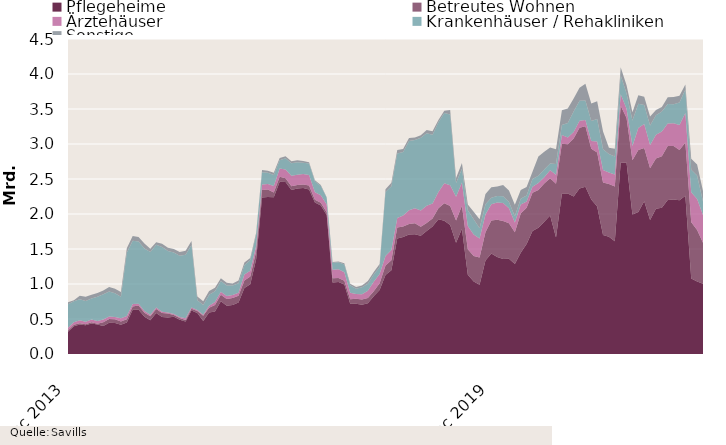
| Category | Pflegeheime | Betreutes Wohnen | Ärztehäuser | Krankenhäuser / Rehakliniken | Sonstige |
|---|---|---|---|---|---|
| 2013-12-01 | 316072110 | 21150000 | 36229348 | 338787993 | 26674299 |
| 2014-01-01 | 396122000 | 21150000 | 36229348 | 301467992 | 14024299 |
| 2014-02-01 | 423017999 | 16996000 | 41229348 | 301467992 | 49024299 |
| 2014-03-01 | 409587999 | 16996000 | 33896100 | 297467994 | 60915344 |
| 2014-04-01 | 436479999 | 16996000 | 38896100 | 299927994 | 54915344 |
| 2014-05-01 | 420451999 | 12372000 | 38896100 | 345627991 | 54915344 |
| 2014-06-01 | 400251999 | 53047000 | 38896100 | 360127987 | 54915344 |
| 2014-07-01 | 447606996 | 53047000 | 35000000 | 357127989 | 63009744 |
| 2014-08-01 | 442116996 | 53047000 | 35000000 | 337739742 | 63009744 |
| 2014-09-01 | 416316995 | 46247000 | 47499999 | 307299740 | 67509743 |
| 2014-10-01 | 450246995 | 46247000 | 47499999 | 901299740 | 65760544 |
| 2014-11-01 | 633736081 | 43759854 | 35999999 | 904699738 | 65760544 |
| 2014-12-01 | 633736081 | 57759854 | 25749999 | 891599738 | 64340644 |
| 2015-01-01 | 530736081 | 57759854 | 25749999 | 891599738 | 71465644 |
| 2015-02-01 | 483168082 | 57759854 | 20749999 | 896099737 | 47465644 |
| 2015-03-01 | 584248082 | 57759854 | 20749999 | 897080987 | 35574599 |
| 2015-04-01 | 529356082 | 57759854 | 15749999 | 924420986 | 46426599 |
| 2015-05-01 | 520608080 | 57759854 | 15749999 | 878720989 | 46426599 |
| 2015-06-01 | 533256112 | 23084854 | 15749999 | 876900990 | 49446599 |
| 2015-07-01 | 490421115 | 23084854 | 15749999 | 875398489 | 52902199 |
| 2015-08-01 | 463331115 | 23084854 | 22535999 | 907658735 | 59202199 |
| 2015-09-01 | 621256115 | 25684854 | 16839999 | 894158738 | 54702200 |
| 2015-10-01 | 587326115 | 25684854 | 16839999 | 139658736 | 52047000 |
| 2015-11-01 | 471877887 | 72825922 | 16839999 | 139508737 | 52047000 |
| 2015-12-01 | 593556246 | 68890922 | 27614999 | 157908739 | 52496999 |
| 2016-01-01 | 606656246 | 93190922 | 41614999 | 153408740 | 50721998 |
| 2016-02-01 | 754539246 | 93190922 | 41614999 | 153858740 | 39721998 |
| 2016-03-01 | 687824246 | 98850422 | 41614999 | 149377489 | 39721998 |
| 2016-04-01 | 701548246 | 98850422 | 41614999 | 136827489 | 28869998 |
| 2016-05-01 | 734016248 | 98850422 | 41614999 | 136827489 | 37869998 |
| 2016-06-01 | 941523216 | 109570422 | 83842999 | 134147490 | 39449998 |
| 2016-07-01 | 997563216 | 109570422 | 83842999 | 153319989 | 28209997 |
| 2016-08-01 | 1353063216 | 109570422 | 80368999 | 163139991 | 26909995 |
| 2016-09-01 | 2236038217 | 106970422 | 78890000 | 174533091 | 31909995 |
| 2016-10-01 | 2242038217 | 106970422 | 78890000 | 160033093 | 30909995 |
| 2016-11-01 | 2237654905 | 70446953 | 92390000 | 156208094 | 32409994 |
| 2016-12-01 | 2458976545 | 74801952 | 115752000 | 118658093 | 33459994 |
| 2017-01-01 | 2457326544 | 55001951 | 125059800 | 158158090 | 28109995 |
| 2017-02-01 | 2342511544 | 55001951 | 149359800 | 178733089 | 28109995 |
| 2017-03-01 | 2363283207 | 49342451 | 149359800 | 177233090 | 28109995 |
| 2017-04-01 | 2371659207 | 49792450 | 149359800 | 159983091 | 28109995 |
| 2017-05-01 | 2351709207 | 54792450 | 149359800 | 164483090 | 19109995 |
| 2017-06-01 | 2165904207 | 38072450 | 107131800 | 154483091 | 16259995 |
| 2017-07-01 | 2122064206 | 38072450 | 107131800 | 133313092 | 14749996 |
| 2017-08-01 | 1987264211 | 38072450 | 111838800 | 93893091 | 9749998 |
| 2017-09-01 | 1022249210 | 59156450 | 121613798 | 101239339 | 11749996 |
| 2017-10-01 | 1028249210 | 59156450 | 122794094 | 101239339 | 11749996 |
| 2017-11-01 | 993351664 | 51823997 | 121994094 | 110189339 | 19607117 |
| 2017-12-01 | 717528269.65 | 64485392.34 | 91375634 | 109439340 | 20394618 |
| 2018-01-01 | 716093269.65 | 73735393.34 | 68067834 | 74639342 | 22894617 |
| 2018-02-01 | 702731268.65 | 75083233.34 | 76967834 | 100209344 | 22894617 |
| 2018-03-01 | 726239605.65 | 75083233.34 | 101967834 | 100209344 | 37894617 |
| 2018-04-01 | 823219606.65 | 74633234.34 | 134166234 | 102309343 | 37894617 |
| 2018-05-01 | 915642106.65 | 94273234.34 | 134166234 | 97809344 | 43894617 |
| 2018-06-01 | 1127762106.65 | 138273234.34 | 134166234 | 912809344 | 42144617 |
| 2018-07-01 | 1195392105.65 | 143673234.34 | 145666234 | 910309345 | 51944617 |
| 2018-08-01 | 1648382098.65 | 157723234.34 | 137647234 | 919564346 | 51944617 |
| 2018-09-01 | 1672277099.66 | 147639234.34 | 158043236 | 907324998 | 44944619 |
| 2018-10-01 | 1707357099.66 | 151089234.34 | 195391740 | 988324994 | 44944619 |
| 2018-11-01 | 1711797099.66 | 155979234.34 | 214712300 | 974149994 | 37837498 |
| 2018-12-01 | 1689070494.01 | 128897840 | 232943760 | 1040049993 | 35549998 |
| 2019-01-01 | 1756635495.01 | 115597839 | 246203760 | 1035349994 | 46839999 |
| 2019-02-01 | 1821157496.01 | 114249999 | 213003760 | 985490494 | 46839999 |
| 2019-03-01 | 1925204184.01 | 156848310 | 233003760 | 994090494 | 33089999 |
| 2019-04-01 | 1902076683.01 | 251948310 | 285155359 | 1002880494 | 33089999 |
| 2019-05-01 | 1844150183.01 | 271883310 | 295091359 | 1009130493 | 65889999 |
| 2019-06-01 | 1589330183.01 | 317883310 | 338910558 | 195630492 | 71139999 |
| 2019-07-01 | 1791050185.01 | 326550262 | 332410558 | 195630492 | 83739997 |
| 2019-08-01 | 1133390186.01 | 363547512 | 332410558 | 222875492 | 83739997 |
| 2019-09-01 | 1035775186 | 363547512 | 308580808 | 217521492 | 105439996 |
| 2019-10-01 | 988695186 | 389797512 | 270052008 | 148221496 | 128973996 |
| 2019-11-01 | 1337476185 | 403512512 | 250531448 | 148518696 | 147173996 |
| 2019-12-01 | 1436021186 | 471912512 | 231531448 | 92118696 | 150234746 |
| 2020-01-01 | 1386087141 | 533140013 | 245211448 | 92118696 | 137444745 |
| 2020-02-01 | 1358892933.36 | 541184833 | 256248136 | 96033196 | 162444745 |
| 2020-03-01 | 1359571245.36 | 509586522 | 211248136 | 91933195 | 164594745 |
| 2020-04-01 | 1285138745.36 | 455118522 | 136898136 | 90543196 | 164594745 |
| 2020-05-01 | 1447483164.36 | 559543521.96 | 126962136 | 84293197 | 125794745 |
| 2020-06-01 | 1572243164.36 | 518143521.96 | 89556937 | 82793198 | 124044744 |
| 2020-07-01 | 1757903270.73 | 545381569.96 | 84556937 | 113523198 | 101644746 |
| 2020-08-01 | 1803513271.73 | 538816589.45 | 102061337 | 103523197 | 274144745 |
| 2020-09-01 | 1888440256.54 | 547632192.28 | 90395087 | 109677196 | 252444746 |
| 2020-10-01 | 1978180292 | 533682192.28 | 111995087 | 97977196 | 228910746 |
| 2020-11-01 | 1665039293 | 767307192.28 | 130112487 | 152879995 | 208460747 |
| 2020-12-01 | 2294464292.86 | 710807192.28 | 124112487 | 143379996 | 207709997 |
| 2021-01-01 | 2291797829.77 | 704629692.28 | 97172487 | 205879995 | 206709998 |
| 2021-02-01 | 2251486125.17 | 827692871.28 | 93575799 | 290996995 | 185699998 |
| 2021-03-01 | 2364136125.17 | 868373933.64 | 100275799 | 286496996 | 184924998 |
| 2021-04-01 | 2389616124.17 | 864137936.64 | 90275800 | 276996996 | 240479998 |
| 2021-05-01 | 2208345705.17 | 724537936.68 | 108436800 | 287996996 | 249129998 |
| 2021-06-01 | 2107366705.17 | 772837936.68 | 155468800 | 321096995 | 253629997 |
| 2021-07-01 | 1698576598.8 | 753200536.68 | 178048800 | 296675495 | 253629997 |
| 2021-08-01 | 1673497598.8 | 755702523.19 | 164044400 | 265675496 | 87993998 |
| 2021-09-01 | 1610965613.99 | 782639920.36 | 169174400 | 258375497 | 111193997 |
| 2021-10-01 | 2735891584.78 | 812109920.36 | 163574400 | 269475497 | 114793997 |
| 2021-11-01 | 2730991584.78 | 639669920.36 | 132957000 | 219275497 | 114793997 |
| 2021-12-01 | 1991871584.92 | 777569920.36 | 200597800 | 364207997 | 118483997 |
| 2022-01-01 | 2027177093.01 | 886182354.36 | 316627799 | 344707998 | 122995997 |
| 2022-02-01 | 2181438858.57 | 762274355.36 | 340687798 | 271440998 | 120005996 |
| 2022-03-01 | 1913613857.57 | 739518293 | 333987798 | 276440998 | 127580995 |
| 2022-04-01 | 2073471001.57 | 719122290 | 339862798 | 279620998 | 72025995 |
| 2022-05-01 | 2087852501.57 | 737359790 | 352709298 | 286620998 | 63375995 |
| 2022-06-01 | 2201316501.57 | 768679139 | 324546350.59 | 278245999 | 95975997 |
| 2022-07-01 | 2207878295.57 | 762639744 | 326355100.59 | 271937499 | 103652497 |
| 2022-08-01 | 2197942295.57 | 715655488 | 358855100.59 | 320237499 | 96788497 |
| 2022-09-01 | 2260309852.07 | 760109931.47 | 423725100.57 | 332737499 | 73588498 |
| 2022-10-01 | 1078818845.82 | 802539930.45 | 428725100.57 | 321637499 | 157293498 |
| 2022-11-01 | 1036133845.82 | 734779930.45 | 442525100.57 | 336637500 | 157293498 |
| 2022-12-01 | 1002833845.82 | 584979930.45 | 397384300.57 | 193505000 | 151293498 |